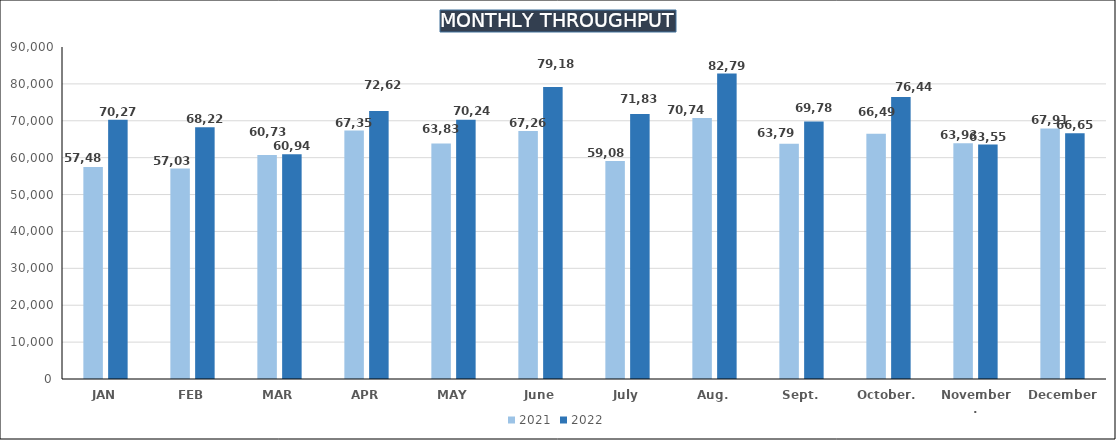
| Category | 2021 | 2022 |
|---|---|---|
| JAN | 57487 | 70275 |
| FEB | 57031 | 68219.75 |
| MAR | 60732 | 60942.5 |
| APR | 67357 | 72624.25 |
| MAY | 63835 | 70246 |
| June | 67261 | 79182.25 |
| July | 59084 | 71836.5 |
| Aug. | 70741 | 82792.75 |
| Sept. | 63793 | 69787 |
| October. | 66496 | 76445.5 |
| November. | 63934 | 63550.5 |
| December | 67911 | 66652.25 |